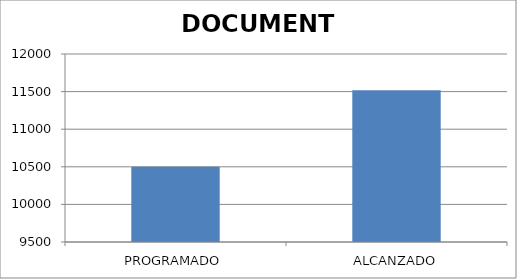
| Category | DOCUMENTO |
|---|---|
| PROGRAMADO | 10500 |
| ALCANZADO | 11518 |